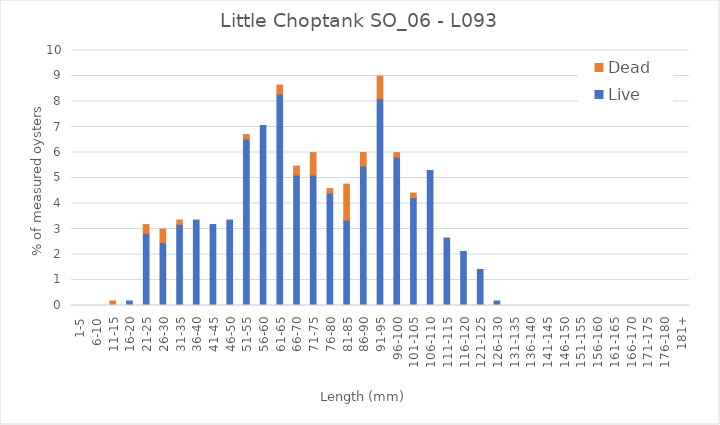
| Category | Live | Dead |
|---|---|---|
| 1-5 | 0 | 0 |
| 6-10 | 0 | 0 |
| 11-15 | 0 | 0.176 |
| 16-20 | 0.176 | 0 |
| 21-25 | 2.822 | 0.353 |
| 26-30 | 2.469 | 0.529 |
| 31-35 | 3.175 | 0.176 |
| 36-40 | 3.351 | 0 |
| 41-45 | 3.175 | 0 |
| 46-50 | 3.351 | 0 |
| 51-55 | 6.526 | 0.176 |
| 56-60 | 7.055 | 0 |
| 61-65 | 8.289 | 0.353 |
| 66-70 | 5.115 | 0.353 |
| 71-75 | 5.115 | 0.882 |
| 76-80 | 4.409 | 0.176 |
| 81-85 | 3.351 | 1.411 |
| 86-90 | 5.467 | 0.529 |
| 91-95 | 8.113 | 0.882 |
| 96-100 | 5.82 | 0.176 |
| 101-105 | 4.233 | 0.176 |
| 106-110 | 5.291 | 0 |
| 111-115 | 2.646 | 0 |
| 116-120 | 2.116 | 0 |
| 121-125 | 1.411 | 0 |
| 126-130 | 0.176 | 0 |
| 131-135 | 0 | 0 |
| 136-140 | 0 | 0 |
| 141-145 | 0 | 0 |
| 146-150 | 0 | 0 |
| 151-155 | 0 | 0 |
| 156-160 | 0 | 0 |
| 161-165 | 0 | 0 |
| 166-170 | 0 | 0 |
| 171-175 | 0 | 0 |
| 176-180 | 0 | 0 |
| 181+ | 0 | 0 |